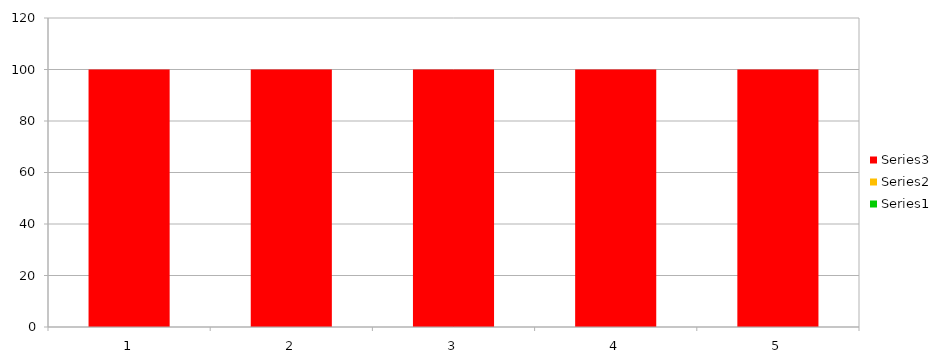
| Category | Series 0 | Series 1 | Series 2 |
|---|---|---|---|
| 0 | 0 | 0 | 100 |
| 1 | 0 | 0 | 100 |
| 2 | 0 | 0 | 100 |
| 3 | 0 | 0 | 100 |
| 4 | 0 | 0 | 100 |